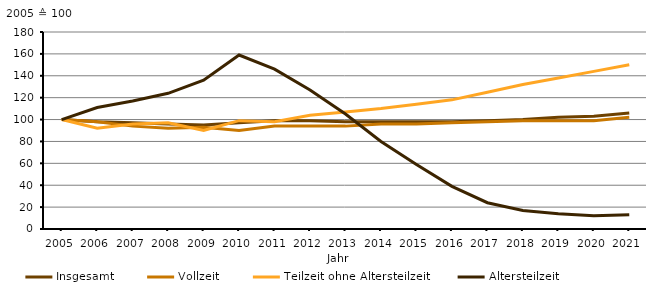
| Category | Insgesamt | Vollzeit | Teilzeit ohne Altersteilzeit | Altersteilzeit |
|---|---|---|---|---|
| 2005.0 | 100 | 100 | 100 | 100 |
| 2006.0 | 98 | 98 | 92 | 111 |
| 2007.0 | 97 | 94 | 96 | 117 |
| 2008.0 | 96 | 92 | 97 | 124 |
| 2009.0 | 95 | 93 | 90 | 136 |
| 2010.0 | 97 | 90 | 99 | 159 |
| 2011.0 | 99 | 94 | 98 | 146 |
| 2012.0 | 99 | 94 | 104 | 127 |
| 2013.0 | 98 | 94 | 107 | 105 |
| 2014.0 | 98 | 96 | 110 | 80 |
| 2015.0 | 98 | 96 | 114 | 59 |
| 2016.0 | 98 | 97 | 118 | 39 |
| 2017.0 | 99 | 98 | 125 | 24 |
| 2018.0 | 100 | 99 | 132 | 17 |
| 2019.0 | 102 | 99 | 138 | 14 |
| 2020.0 | 103 | 99 | 144 | 12 |
| 2021.0 | 106 | 102 | 150 | 13 |